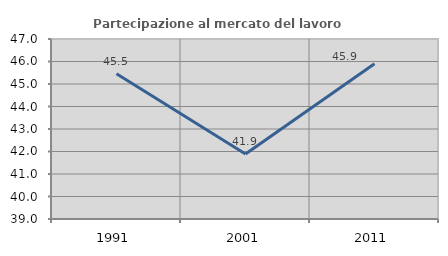
| Category | Partecipazione al mercato del lavoro  femminile |
|---|---|
| 1991.0 | 45.455 |
| 2001.0 | 41.892 |
| 2011.0 | 45.902 |